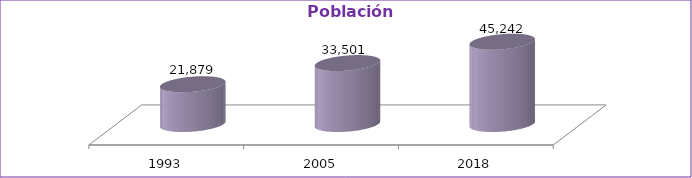
| Category | Población Total |
|---|---|
| 1993 | 21879 |
| 2005 | 33501 |
| 2018 | 45242 |